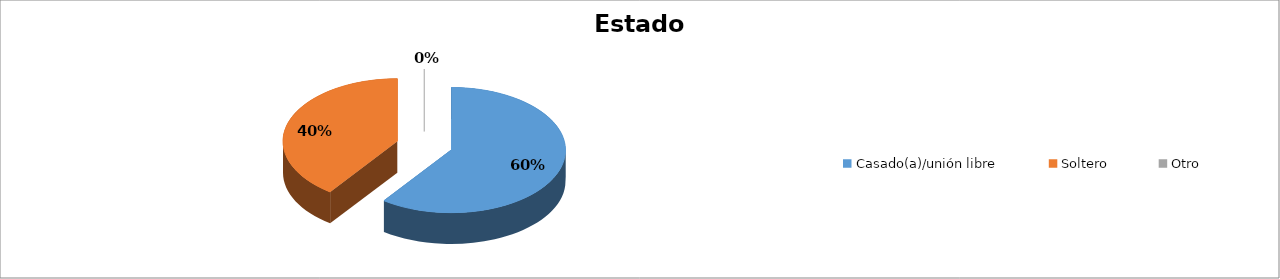
| Category | Series 0 |
|---|---|
| Casado(a)/unión libre | 0.6 |
| Soltero | 0.4 |
| Otro | 0 |